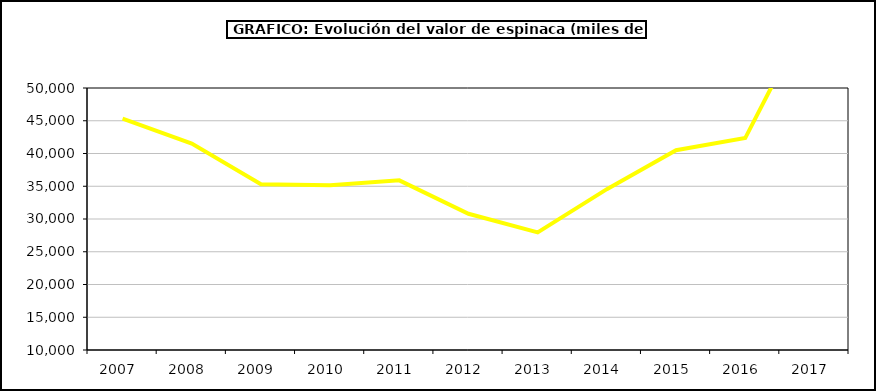
| Category | Valor |
|---|---|
| 2007.0 | 45310.858 |
| 2008.0 | 41526.143 |
| 2009.0 | 35291.496 |
| 2010.0 | 35154.695 |
| 2011.0 | 35899.468 |
| 2012.0 | 30801.916 |
| 2013.0 | 27951.792 |
| 2014.0 | 34558.726 |
| 2015.0 | 40502 |
| 2016.0 | 42355 |
| 2017.0 | 62868.236 |